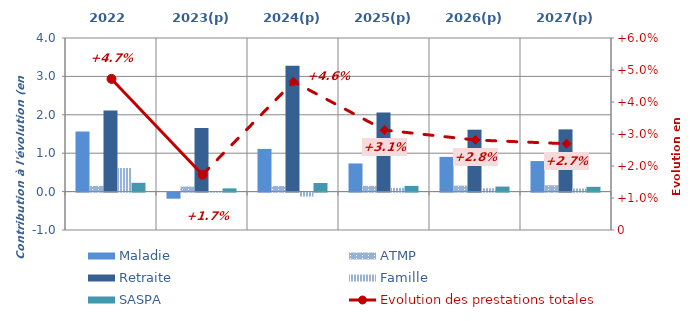
| Category | Maladie | ATMP | Retraite | Famille | SASPA |
|---|---|---|---|---|---|
| 2022 | 1.565 | 0.148 | 2.111 | 0.614 | 0.229 |
| 2023(p) | -0.158 | 0.13 | 1.655 | 0.006 | 0.084 |
| 2024(p) | 1.112 | 0.146 | 3.279 | -0.103 | 0.224 |
| 2025(p) | 0.733 | 0.15 | 2.06 | 0.097 | 0.149 |
| 2026(p) | 0.904 | 0.156 | 1.613 | 0.089 | 0.132 |
| 2027(p) | 0.795 | 0.166 | 1.62 | 0.081 | 0.124 |